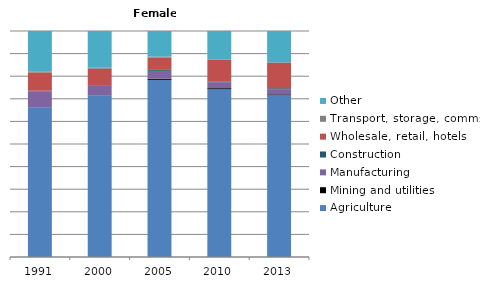
| Category | Agriculture | Mining and utilities | Manufacturing | Construction | Wholesale, retail, hotels | Transport, storage, comms | Other |
|---|---|---|---|---|---|---|---|
| 1991.0 | 66.1 | 0.1 | 7 | 0.3 | 8.1 | 0.3 | 18 |
| 2000.0 | 71.4 | 0.1 | 4.1 | 0.3 | 7.3 | 0.4 | 16.3 |
| 2005.0 | 78.3 | 0.5 | 3.5 | 0.4 | 5.5 | 0.4 | 11.3 |
| 2010.0 | 74.3 | 0.4 | 2.6 | 0.4 | 9.5 | 0.3 | 12.5 |
| 2013.0 | 71.5 | 0.4 | 2.3 | 0.4 | 11.2 | 0.3 | 13.8 |